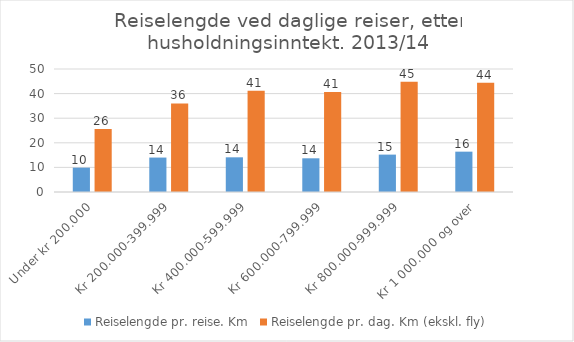
| Category | Reiselengde pr. reise. Km | Reiselengde pr. dag. Km (ekskl. fly) |
|---|---|---|
| Under kr 200.000 | 9.9 | 25.6 |
| Kr 200.000-399.999 | 14 | 36 |
| Kr 400.000-599.999 | 14.1 | 41.2 |
| Kr 600.000-799.999 | 13.7 | 40.6 |
| Kr 800.000-999.999 | 15.2 | 44.8 |
| Kr 1 000.000 og over | 16.4 | 44.4 |